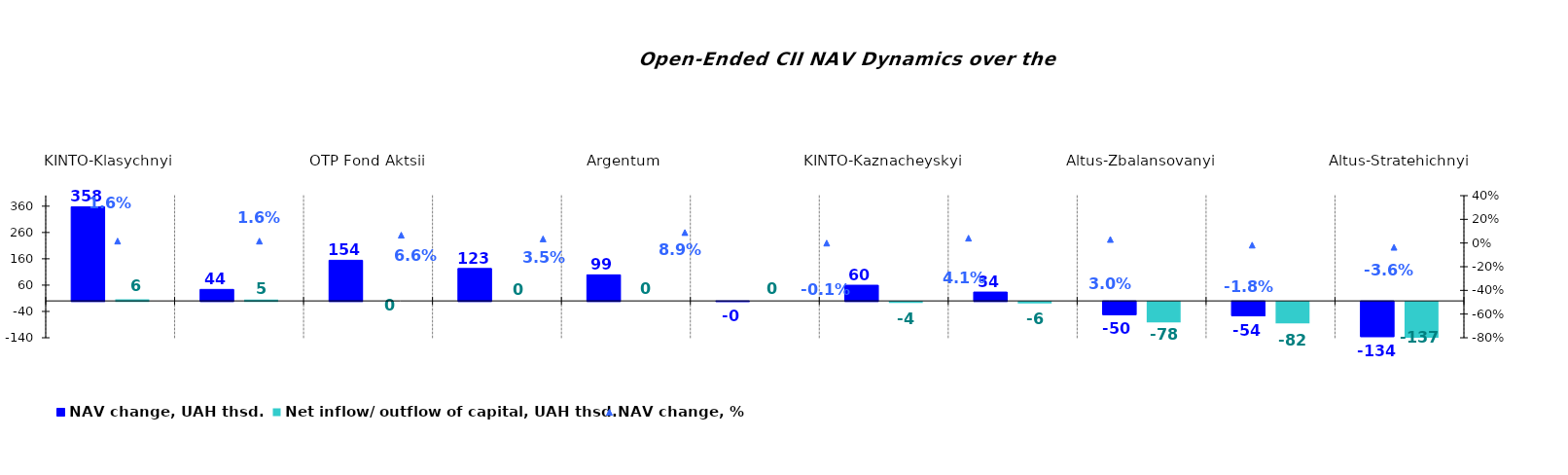
| Category | NAV change, UAH thsd. | Net inflow/ outflow of capital, UAH thsd. |
|---|---|---|
| KINTO-Klasychnyi | 357.557 | 6.119 |
| ОТP Klasychnyi | 43.673 | 5.313 |
| ОТP Fond Aktsii | 154.435 | 0 |
| KINTO-Ekviti | 123.265 | 0 |
| Аrgentum | 99.064 | 0 |
| Bonum Optimum | -0.389 | 0 |
| KINTO-Kaznacheyskyi | 59.579 | -4.218 |
| UNIVER.UA/Volodymyr Velykyi: Fond Zbalansovanyi | 33.604 | -5.77 |
| Altus-Zbalansovanyi | -49.954 | -78.132 |
| VSI | -54.388 | -82.133 |
| Altus-Stratehichnyi | -133.806 | -137.051 |